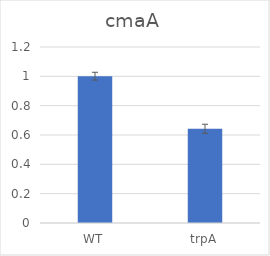
| Category | Series 0 |
|---|---|
| WT | 1.001 |
| trpA | 0.642 |